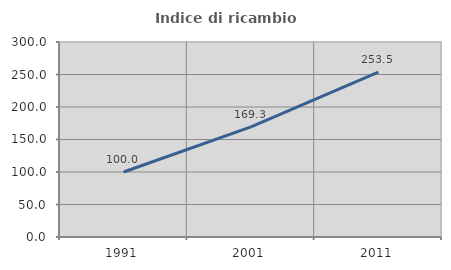
| Category | Indice di ricambio occupazionale  |
|---|---|
| 1991.0 | 100 |
| 2001.0 | 169.298 |
| 2011.0 | 253.488 |